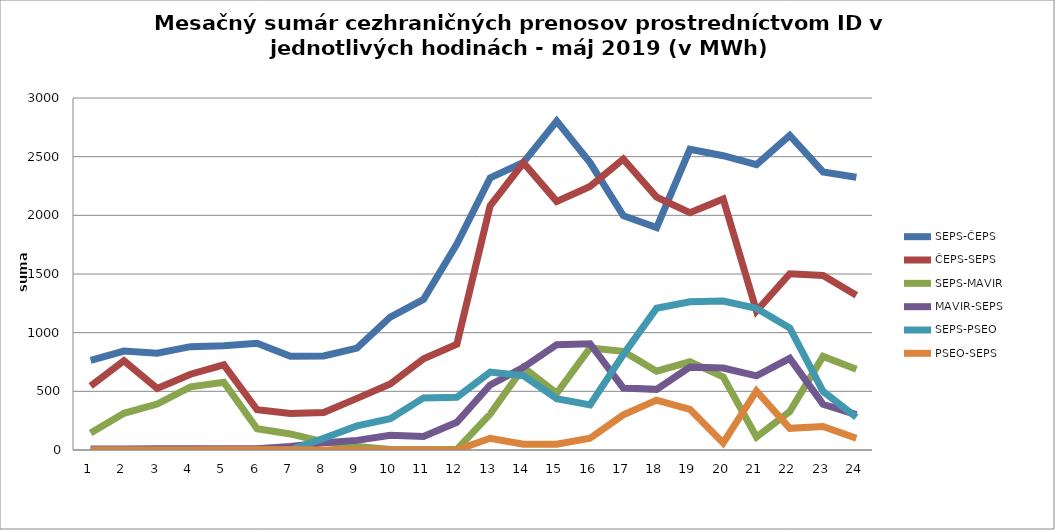
| Category | SEPS-ČEPS | ČEPS-SEPS | SEPS-MAVIR | MAVIR-SEPS | SEPS-PSEO | PSEO-SEPS |
|---|---|---|---|---|---|---|
| 1.0 | 764 | 546 | 144 | 9 | 0 | 0 |
| 2.0 | 843 | 761 | 313 | 9 | 0 | 0 |
| 3.0 | 825 | 524 | 392 | 11 | 0 | 0 |
| 4.0 | 881 | 646 | 538 | 11 | 0 | 0 |
| 5.0 | 889 | 726 | 578 | 11 | 0 | 3 |
| 6.0 | 909 | 343 | 181 | 11 | 0 | 3 |
| 7.0 | 799 | 311 | 137 | 30 | 0 | 2 |
| 8.0 | 802 | 320 | 68 | 61 | 100 | 0 |
| 9.0 | 869 | 440 | 30 | 82 | 205 | 0 |
| 10.0 | 1133 | 563 | 5 | 125 | 267 | 0 |
| 11.0 | 1284 | 778 | 5 | 115 | 444 | 0 |
| 12.0 | 1756 | 902 | 5 | 236 | 450 | 0 |
| 13.0 | 2319 | 2081 | 306 | 554 | 664 | 100 |
| 14.0 | 2451 | 2448 | 704 | 705 | 633 | 50 |
| 15.0 | 2803 | 2119 | 484 | 898 | 437 | 50 |
| 16.0 | 2450 | 2246 | 870 | 906 | 385 | 100 |
| 17.0 | 1997 | 2479 | 841 | 528 | 813 | 300 |
| 18.0 | 1895 | 2155 | 672 | 517 | 1208 | 425 |
| 19.0 | 2563 | 2023 | 752 | 707 | 1263 | 347 |
| 20.0 | 2508 | 2139 | 623 | 698 | 1269 | 60 |
| 21.0 | 2433 | 1185 | 111 | 632 | 1208 | 503 |
| 22.0 | 2682 | 1502 | 327 | 781 | 1040 | 185 |
| 23.0 | 2370 | 1487 | 798 | 389 | 500 | 200 |
| 24.0 | 2324 | 1318 | 688 | 301 | 280 | 100 |